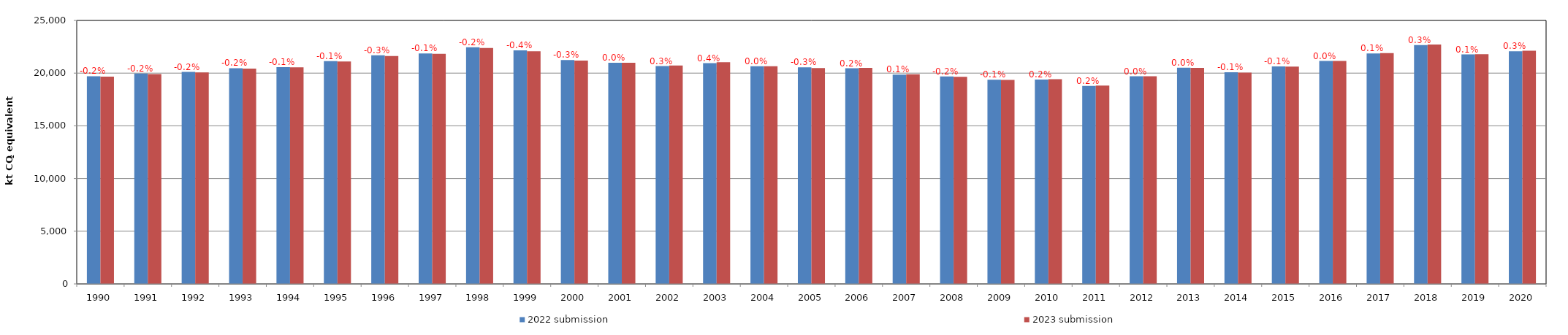
| Category | 2022 submission | 2023 submission |
|---|---|---|
| 1990.0 | 19702.888 | 19668.606 |
| 1991.0 | 19953.384 | 19914.53 |
| 1992.0 | 20111.303 | 20070.946 |
| 1993.0 | 20469.004 | 20437.538 |
| 1994.0 | 20573.938 | 20556.232 |
| 1995.0 | 21140.745 | 21112.769 |
| 1996.0 | 21687.714 | 21626.98 |
| 1997.0 | 21859.401 | 21836.171 |
| 1998.0 | 22446.377 | 22393.611 |
| 1999.0 | 22164.386 | 22078.409 |
| 2000.0 | 21236.091 | 21182.751 |
| 2001.0 | 20986.831 | 20977.061 |
| 2002.0 | 20666.715 | 20731.388 |
| 2003.0 | 20948.683 | 21032.152 |
| 2004.0 | 20654.393 | 20655.585 |
| 2005.0 | 20543.961 | 20487.522 |
| 2006.0 | 20459.276 | 20494.828 |
| 2007.0 | 19866.29 | 19885.847 |
| 2008.0 | 19688.355 | 19653.81 |
| 2009.0 | 19374.806 | 19358.808 |
| 2010.0 | 19386.006 | 19427.951 |
| 2011.0 | 18790.863 | 18821.034 |
| 2012.0 | 19701.828 | 19706.417 |
| 2013.0 | 20512.38 | 20504.139 |
| 2014.0 | 20075.574 | 20056.242 |
| 2015.0 | 20637.177 | 20620.343 |
| 2016.0 | 21154.325 | 21161.488 |
| 2017.0 | 21871.197 | 21897.672 |
| 2018.0 | 22659 | 22719.206 |
| 2019.0 | 21772.07 | 21789.781 |
| 2020.0 | 22074.239 | 22133.282 |